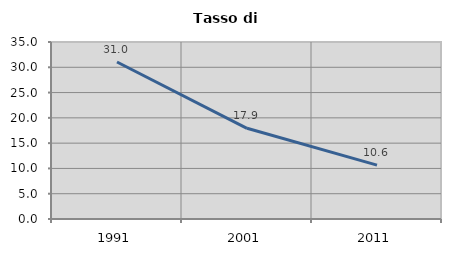
| Category | Tasso di disoccupazione   |
|---|---|
| 1991.0 | 31.041 |
| 2001.0 | 17.932 |
| 2011.0 | 10.649 |